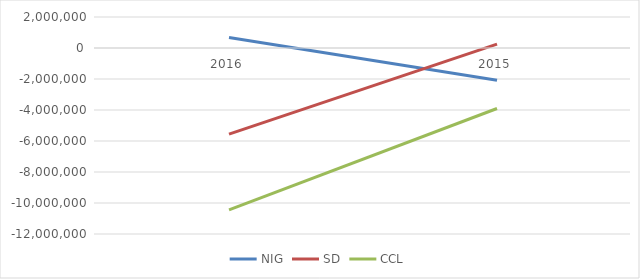
| Category | NIG | SD | CCL |
|---|---|---|---|
| 2016.0 | 670564.7 | -5557363.7 | -4886799 |
| 2015.0 | -2076494.5 | 249070.5 | -1827424 |